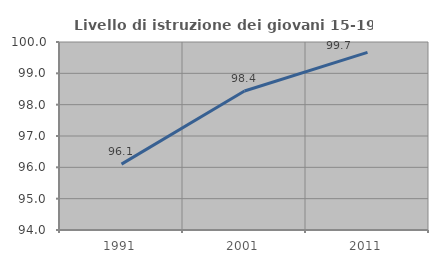
| Category | Livello di istruzione dei giovani 15-19 anni |
|---|---|
| 1991.0 | 96.101 |
| 2001.0 | 98.438 |
| 2011.0 | 99.671 |